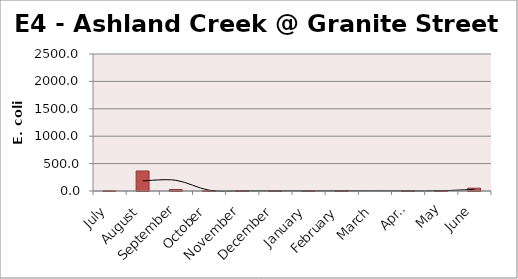
| Category | E. coli MPN |
|---|---|
| July | 4.1 |
| August | 365.4 |
| September | 26.2 |
| October | 3 |
| November | 1 |
| December | 2 |
| January | 1 |
| February | 5.2 |
| March | 0 |
| April | 2 |
| May | 8.4 |
| June | 51.2 |